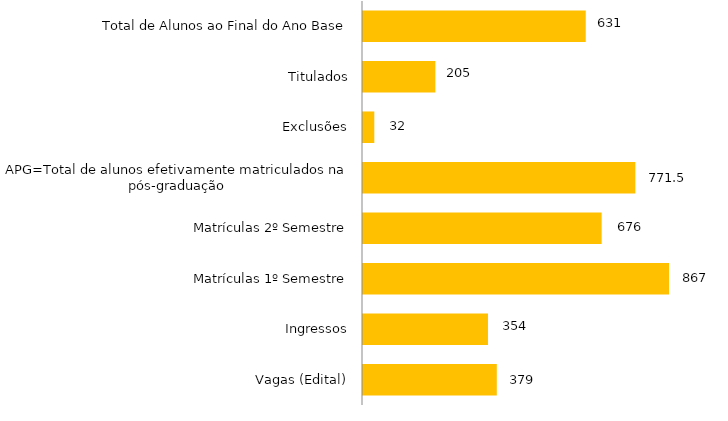
| Category | Curso |
|---|---|
| Vagas (Edital) | 379 |
| Ingressos | 354 |
| Matrículas 1º Semestre | 867 |
| Matrículas 2º Semestre | 676 |
| APG=Total de alunos efetivamente matriculados na pós-graduação | 771.5 |
| Exclusões | 32 |
| Titulados | 205 |
| Total de Alunos ao Final do Ano Base | 631 |